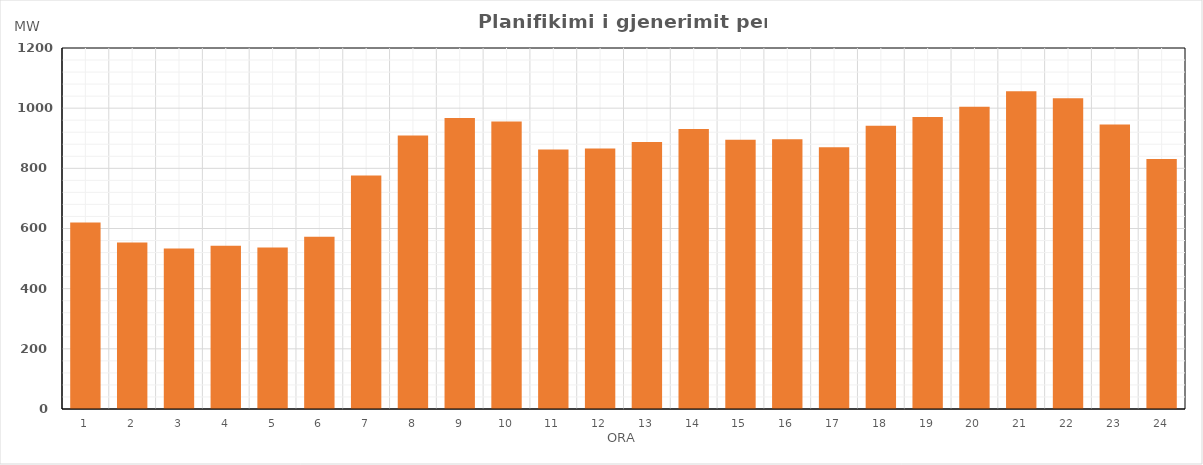
| Category | Max (MW) |
|---|---|
| 0 | 619.66 |
| 1 | 553.37 |
| 2 | 533.69 |
| 3 | 542.57 |
| 4 | 537.06 |
| 5 | 572.25 |
| 6 | 776.36 |
| 7 | 908.93 |
| 8 | 967.7 |
| 9 | 955.53 |
| 10 | 862.54 |
| 11 | 865.65 |
| 12 | 887.3 |
| 13 | 930.64 |
| 14 | 894.73 |
| 15 | 896.81 |
| 16 | 870.3 |
| 17 | 941.53 |
| 18 | 970.65 |
| 19 | 1004.35 |
| 20 | 1056.56 |
| 21 | 1033.28 |
| 22 | 946.02 |
| 23 | 830.81 |